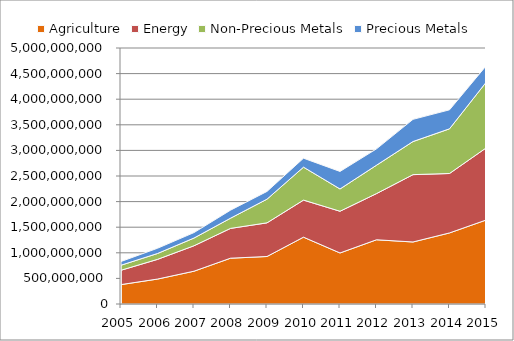
| Category | Agriculture | Energy | Non-Precious Metals | Precious Metals |
|---|---|---|---|---|
| 2005 | 378897205.96 | 280133406 | 98494236 | 72532719 |
| 2006 | 486903947.72 | 384723413 | 115001033 | 102279416 |
| 2007 | 640678206.38 | 496770611 | 150975562 | 106821904 |
| 2008 | 894620553 | 582115347 | 198715367 | 157395388 |
| 2009 | 927738831 | 657043981 | 462823525 | 151451722 |
| 2010 | 1305528728 | 723618122 | 643646061 | 174946553 |
| 2011 | 996794332 | 814826810 | 435115597 | 342134687 |
| 2012 | 1254427430 | 901916482 | 554253755 | 319434323 |
| 2013 | 1211397795 | 1315403564 | 646353600 | 433708193 |
| 2014 | 1387993407 | 1160869956 | 872626126 | 371064966 |
| 2015 | 1639668492 | 1407235307 | 1280935517 | 321272201 |